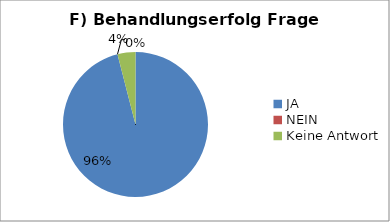
| Category | Series 0 |
|---|---|
| JA | 48 |
| NEIN | 0 |
| Keine Antwort | 2 |